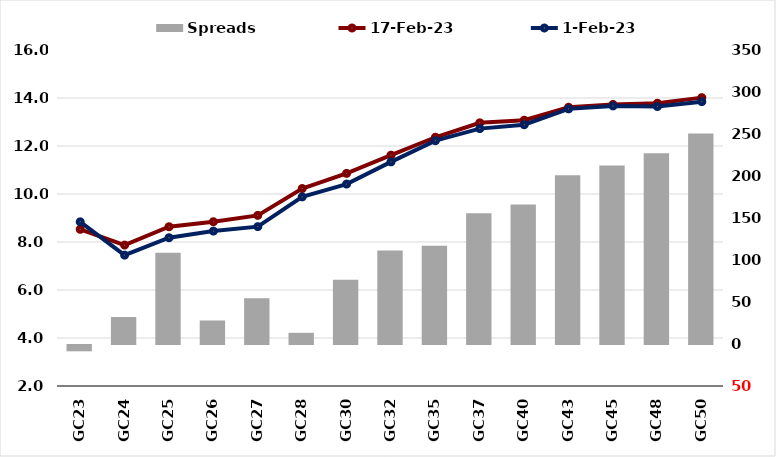
| Category |  Spreads   |
|---|---|
| GC23 | -7.497 |
| GC24 | 32.155 |
| GC25 | 108.584 |
| GC26 | 28.007 |
| GC27 | 54.464 |
| GC28 | 13.301 |
| GC30 | 76.391 |
| GC32 | 111.445 |
| GC35 | 116.894 |
| GC37 | 155.594 |
| GC40 | 166.096 |
| GC43 | 200.858 |
| GC45 | 212.64 |
| GC48 | 227.078 |
| GC50 | 250.522 |